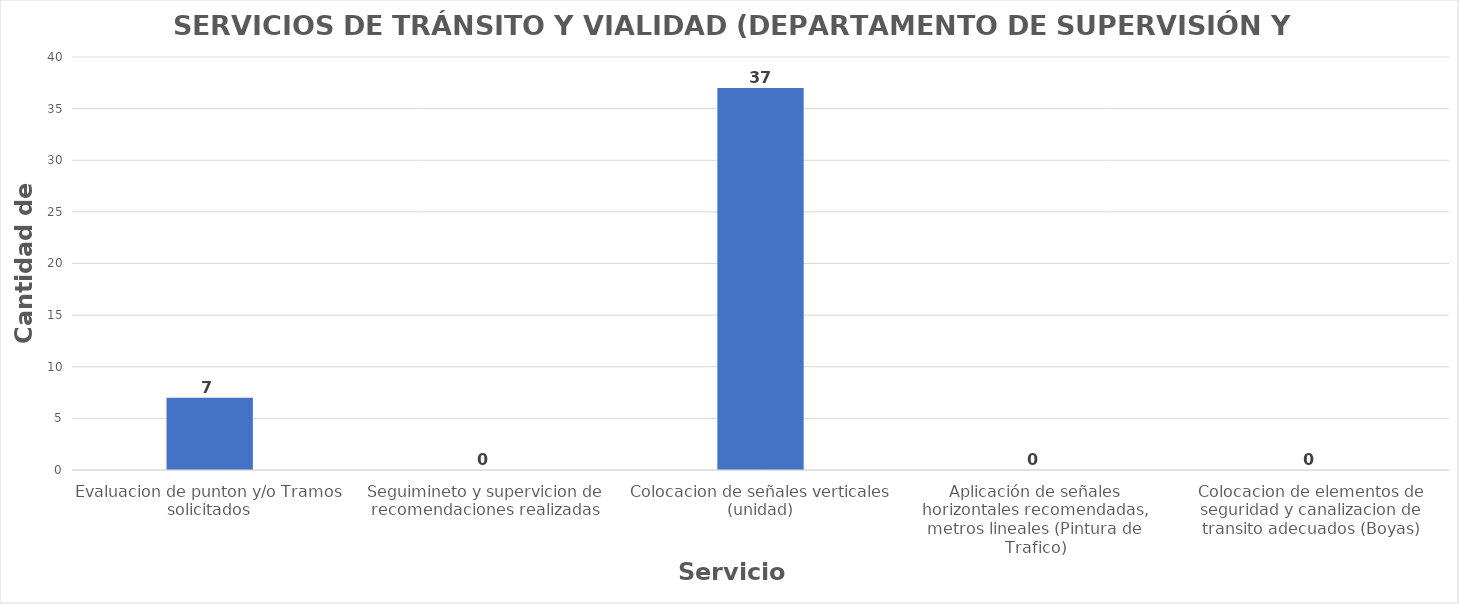
| Category | Series 0 |
|---|---|
| Evaluacion de punton y/o Tramos solicitados | 7 |
| Seguimineto y supervicion de recomendaciones realizadas | 0 |
| Colocacion de señales verticales (unidad) | 37 |
| Aplicación de señales horizontales recomendadas, metros lineales (Pintura de Trafico) | 0 |
| Colocacion de elementos de seguridad y canalizacion de transito adecuados (Boyas) | 0 |